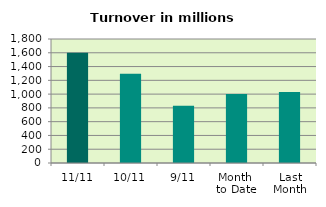
| Category | Series 0 |
|---|---|
| 11/11 | 1599.22 |
| 10/11 | 1296.198 |
| 9/11 | 832.46 |
| Month 
to Date | 1002.877 |
| Last
Month | 1032.218 |